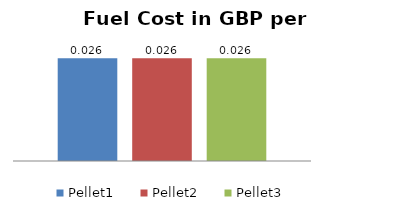
| Category | Pellet1 | Pellet2 | Pellet3 |
|---|---|---|---|
|  | 0.026 | 0.026 | 0.026 |